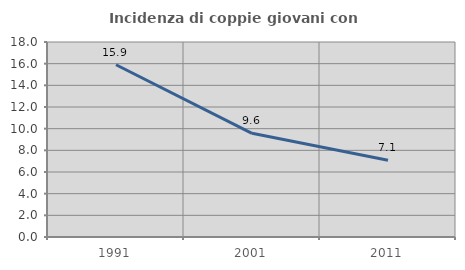
| Category | Incidenza di coppie giovani con figli |
|---|---|
| 1991.0 | 15.901 |
| 2001.0 | 9.573 |
| 2011.0 | 7.091 |